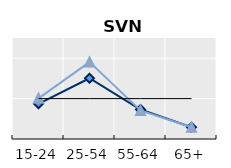
| Category | Né à l'étranger | Né dans le pays | Series 1 |
|---|---|---|---|
| 15-24 | 0.871 | 1.007 | 1 |
| 25-54 | 1.504 | 1.903 | 1 |
| 55-64 | 0.73 | 0.707 | 1 |
| 65+ | 0.291 | 0.292 | 1 |